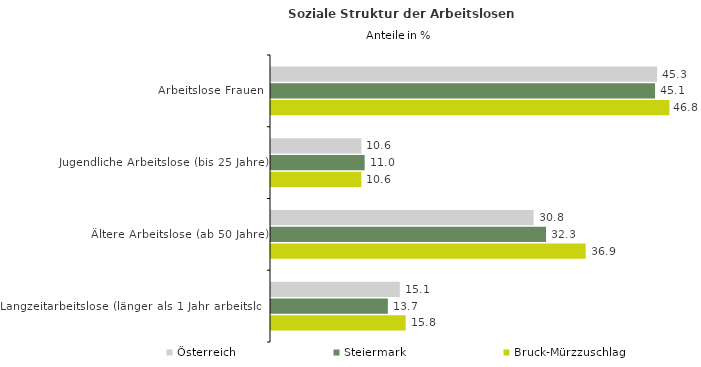
| Category | Österreich | Steiermark | Bruck-Mürzzuschlag |
|---|---|---|---|
| Arbeitslose Frauen | 45.325 | 45.075 | 46.767 |
| Jugendliche Arbeitslose (bis 25 Jahre) | 10.608 | 10.993 | 10.603 |
| Ältere Arbeitslose (ab 50 Jahre) | 30.822 | 32.281 | 36.932 |
| Langzeitarbeitslose (länger als 1 Jahr arbeitslos) | 15.122 | 13.717 | 15.808 |